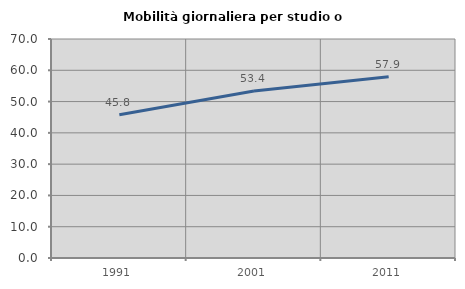
| Category | Mobilità giornaliera per studio o lavoro |
|---|---|
| 1991.0 | 45.794 |
| 2001.0 | 53.355 |
| 2011.0 | 57.91 |